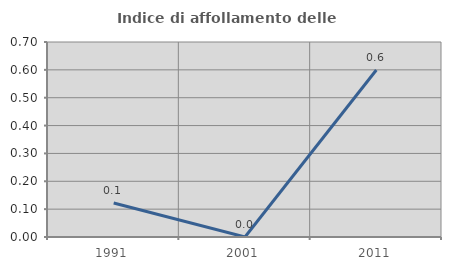
| Category | Indice di affollamento delle abitazioni  |
|---|---|
| 1991.0 | 0.122 |
| 2001.0 | 0 |
| 2011.0 | 0.599 |